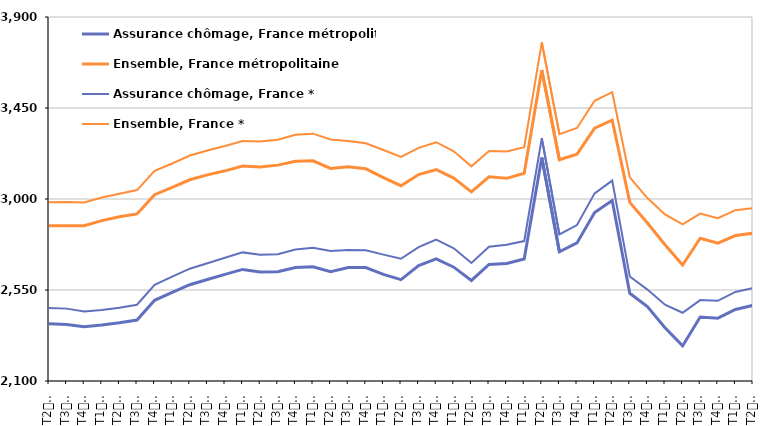
| Category | Assurance chômage, France métropolitaine | Ensemble, France métropolitaine | Assurance chômage, France * | Ensemble, France * |
|---|---|---|---|---|
| T2
2013 | 2382.7 | 2867.2 | 2461.6 | 2984.3 |
| T3
2013 | 2379.9 | 2868.3 | 2457.9 | 2985 |
| T4
2013 | 2368 | 2867.5 | 2444 | 2982.8 |
| T1
2014 | 2376.7 | 2893.2 | 2451.1 | 3007.5 |
| T2
2014 | 2387.9 | 2912 | 2462 | 3025.7 |
| T3
2014 | 2401.2 | 2926.3 | 2477 | 3044.2 |
| T4
2014 | 2499.2 | 3021.1 | 2575.9 | 3139.2 |
| T1
2015 | 2538 | 3056.9 | 2616.1 | 3175.6 |
| T2
2015 | 2576.2 | 3095.1 | 2655.4 | 3214.8 |
| T3
2015 | 2601.7 | 3119.2 | 2682 | 3239.6 |
| T4
2015 | 2627 | 3139.3 | 2709.3 | 3261.7 |
| T1
2016 | 2651.8 | 3163.2 | 2736 | 3287.2 |
| T2
2016 | 2639.3 | 3158.5 | 2724.5 | 3284.7 |
| T3
2016 | 2640.2 | 3167.5 | 2726.6 | 3292.6 |
| T4
2016 | 2661.4 | 3187.1 | 2750.6 | 3317.2 |
| T1
2017 | 2665 | 3188.8 | 2759.2 | 3323.2 |
| T2
2017 | 2640.5 | 3151.4 | 2743.1 | 3294.5 |
| T3
2017 | 2660.9 | 3159.5 | 2747.4 | 3287.1 |
| T4
2017 | 2661.2 | 3149.3 | 2746.8 | 3275.3 |
| T1
2018 | 2627.3 | 3105.4 | 2724.8 | 3242.6 |
| T2
2018 | 2601.4 | 3065.8 | 2704.4 | 3208 |
| T3
2018 | 2670.9 | 3121.1 | 2762.3 | 3252.6 |
| T4
2018 | 2703.6 | 3145.7 | 2799.2 | 3280.7 |
| T1
2019 | 2662.9 | 3103.7 | 2756.2 | 3235.7 |
| T2
2019 | 2597.1 | 3035.5 | 2683.9 | 3161.5 |
| T3
2019 | 2676.7 | 3109.4 | 2764.1 | 3236.8 |
| T4
2019 | 2680.9 | 3102.2 | 2773.9 | 3234.5 |
| T1
2020 | 2703.6 | 3127.5 | 2792 | 3255.8 |
| T2
2020 | 3204.8 | 3637.8 | 3300.5 | 3774.3 |
| T3
2020 | 2738.7 | 3193.9 | 2824.7 | 3320.8 |
| T4
2020 | 2782.9 | 3221.9 | 2871.3 | 3351.2 |
| T1
2021 | 2933.4 | 3350.1 | 3028.1 | 3485.7 |
| T2
2021 | 2992.4 | 3389.5 | 3091.1 | 3528.2 |
| T3
2021 | 2533.6 | 2983.4 | 2616.7 | 3107.3 |
| T4
2021 | 2468.1 | 2881.5 | 2552.1 | 3004.6 |
| T1
2022 | 2363.1 | 2773.9 | 2477.2 | 2923.9 |
| T2
2022 | 2273.5 | 2673.4 | 2437.6 | 2874.8 |
| T3
2022 | 2416.3 | 2805.7 | 2500.2 | 2928.1 |
| T4
2022 | 2410.9 | 2781.5 | 2496.5 | 2904.8 |
| T1
2023 | 2453.5 | 2819.4 | 2540.6 | 2944.8 |
| T2
2023 | 2473.7 | 2830.6 | 2559.9 | 2955.2 |